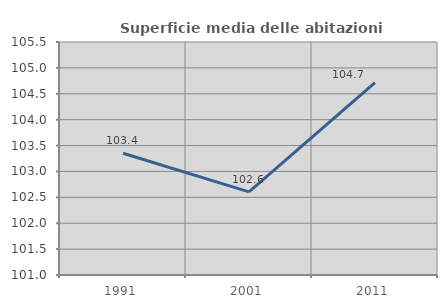
| Category | Superficie media delle abitazioni occupate |
|---|---|
| 1991.0 | 103.352 |
| 2001.0 | 102.606 |
| 2011.0 | 104.717 |